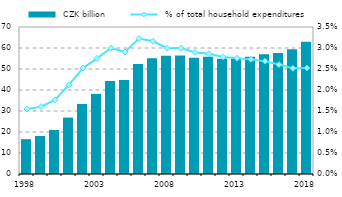
| Category |  CZK billion |
|---|---|
| 1998.0 | 16.585 |
| 1999.0 | 18.111 |
| 2000.0 | 20.957 |
| 2001.0 | 26.864 |
| 2002.0 | 33.362 |
| 2003.0 | 38.166 |
| 2004.0 | 44.311 |
| 2005.0 | 44.744 |
| 2006.0 | 52.433 |
| 2007.0 | 55.099 |
| 2008.0 | 56.288 |
| 2009.0 | 56.482 |
| 2010.0 | 55.364 |
| 2011.0 | 55.839 |
| 2012.0 | 54.936 |
| 2013.0 | 55.048 |
| 2014.0 | 55.791 |
| 2015.0 | 57.067 |
| 2016.0 | 57.652 |
| 2017.0 | 59.425 |
| 2018.0 | 62.946 |